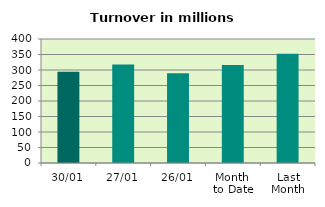
| Category | Series 0 |
|---|---|
| 30/01 | 294.041 |
| 27/01 | 317.825 |
| 26/01 | 289.868 |
| Month 
to Date | 316.137 |
| Last
Month | 352.227 |